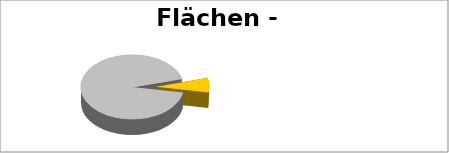
| Category | 0 |
|---|---|
| Solarstrom | 187.45 |
| Solares Heizen | 14 |